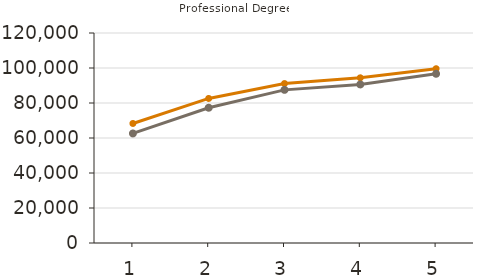
| Category | Mean | Median |
|---|---|---|
| 1.0 | 68300 | 62600 |
| 2.0 | 82600 | 77300 |
| 3.0 | 91100 | 87500 |
| 4.0 | 94400 | 90600 |
| 5.0 | 99600 | 96700 |